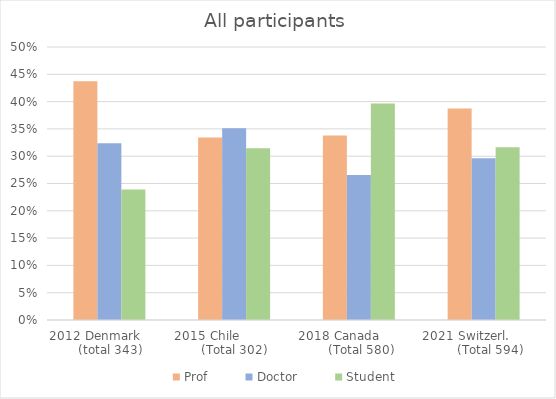
| Category | Prof | Doctor | Student |
|---|---|---|---|
| 2012 Denmark         (total 343) | 0.437 | 0.324 | 0.239 |
| 2015 Chile                (Total 302) | 0.334 | 0.351 | 0.315 |
| 2018 Canada             (Total 580) | 0.338 | 0.266 | 0.397 |
| 2021 Switzerl.              (Total 594) | 0.387 | 0.296 | 0.316 |